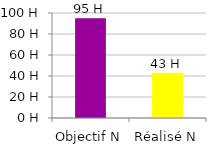
| Category | Series 0 |
|---|---|
| Objectif N | 95 |
| Réalisé N | 43 |